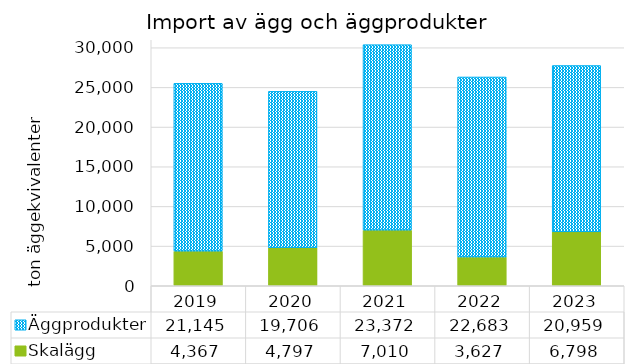
| Category | Skalägg | Äggprodukter |
|---|---|---|
| 2019 | 4367 | 21145.1 |
| 2020 | 4797 | 19706.38 |
| 2021 | 7010 | 23372.08 |
| 2022 | 3627 | 22682.98 |
| 2023 | 6798 | 20959.02 |